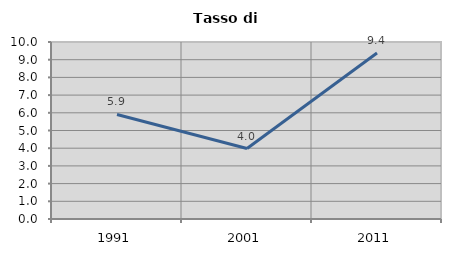
| Category | Tasso di disoccupazione   |
|---|---|
| 1991.0 | 5.907 |
| 2001.0 | 3.983 |
| 2011.0 | 9.376 |